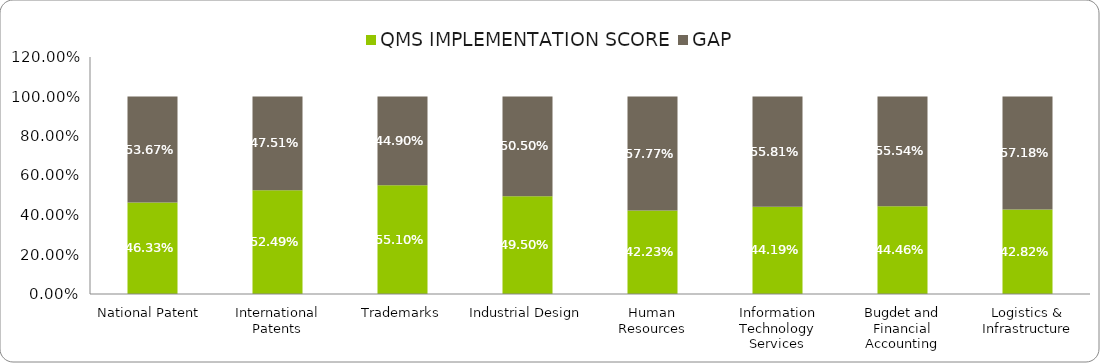
| Category | QMS IMPLEMENTATION SCORE | GAP |
|---|---|---|
| National Patent  | 0.463 | 0.537 |
| International Patents | 0.525 | 0.475 |
| Trademarks | 0.551 | 0.449 |
| Industrial Design | 0.495 | 0.505 |
| Human Resources | 0.422 | 0.578 |
| Information Technology Services | 0.442 | 0.558 |
| Bugdet and Financial Accounting | 0.445 | 0.555 |
| Logistics & Infrastructure | 0.428 | 0.572 |